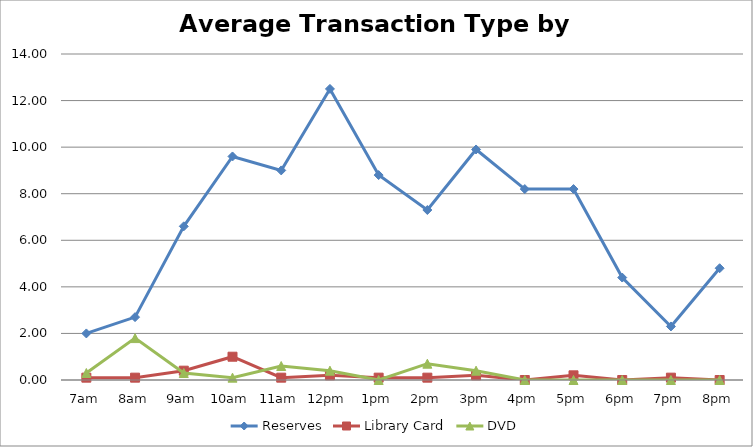
| Category | Reserves | Library Card | DVD |
|---|---|---|---|
| 7am | 2 | 0.1 | 0.3 |
| 8am | 2.7 | 0.1 | 1.8 |
| 9am | 6.6 | 0.4 | 0.3 |
| 10am | 9.6 | 1 | 0.1 |
| 11am | 9 | 0.1 | 0.6 |
| 12pm | 12.5 | 0.2 | 0.4 |
| 1pm | 8.8 | 0.1 | 0 |
| 2pm | 7.3 | 0.1 | 0.7 |
| 3pm | 9.9 | 0.2 | 0.4 |
| 4pm | 8.2 | 0 | 0 |
| 5pm | 8.2 | 0.2 | 0 |
| 6pm | 4.4 | 0 | 0 |
| 7pm | 2.3 | 0.1 | 0 |
| 8pm | 4.8 | 0 | 0 |